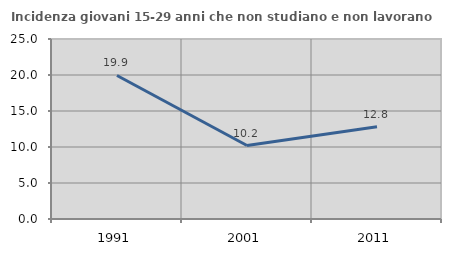
| Category | Incidenza giovani 15-29 anni che non studiano e non lavorano  |
|---|---|
| 1991.0 | 19.937 |
| 2001.0 | 10.206 |
| 2011.0 | 12.824 |